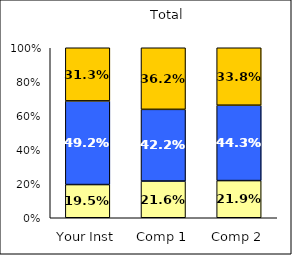
| Category | Low Civic Engagement | Average Civic Engagement | High Civic Engagement |
|---|---|---|---|
| Your Inst | 0.195 | 0.492 | 0.312 |
| Comp 1 | 0.216 | 0.422 | 0.362 |
| Comp 2 | 0.219 | 0.443 | 0.338 |